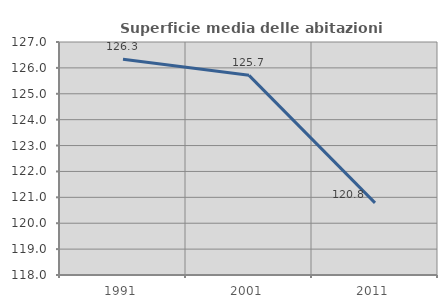
| Category | Superficie media delle abitazioni occupate |
|---|---|
| 1991.0 | 126.333 |
| 2001.0 | 125.712 |
| 2011.0 | 120.785 |